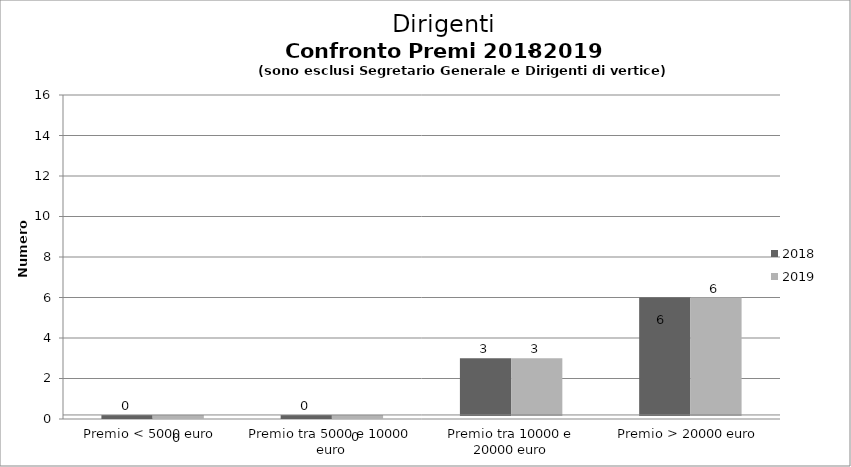
| Category | 2018 | 2019 |
|---|---|---|
| Premio < 5000 euro | 0 | 0 |
| Premio tra 5000 e 10000 euro | 0 | 0 |
| Premio tra 10000 e 20000 euro | 3 | 3 |
| Premio > 20000 euro | 6 | 6 |